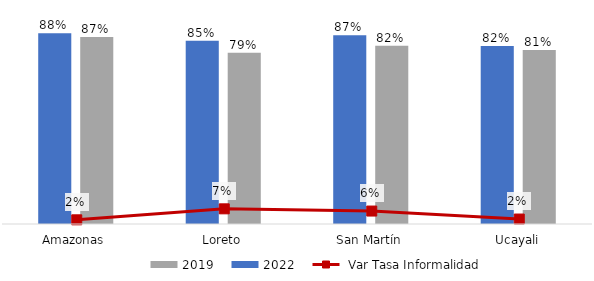
| Category | 2022 | 2019 |
|---|---|---|
| Amazonas | 0.883 | 0.866 |
| Loreto | 0.848 | 0.792 |
| San Martín | 0.874 | 0.825 |
| Ucayali | 0.824 | 0.805 |